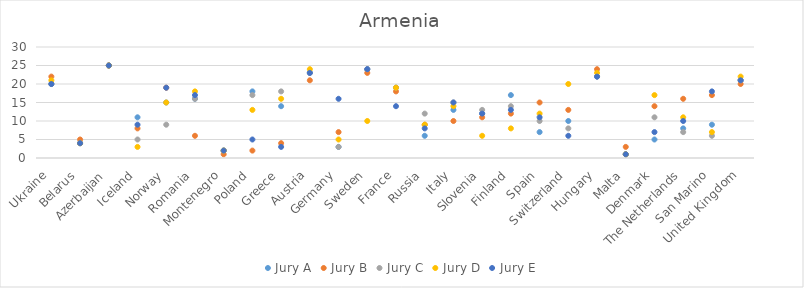
| Category | Jury A | Jury B | Jury C | Jury D | Jury E |
|---|---|---|---|---|---|
| Ukraine | 20 | 22 | 20 | 21 | 20 |
| Belarus | 4 | 5 | 4 | 4 | 4 |
| Azerbaijan | 25 | 25 | 25 | 25 | 25 |
| Iceland | 11 | 8 | 5 | 3 | 9 |
| Norway | 15 | 19 | 9 | 15 | 19 |
| Romania | 16 | 6 | 16 | 18 | 17 |
| Montenegro | 2 | 1 | 2 | 2 | 2 |
| Poland | 18 | 2 | 17 | 13 | 5 |
| Greece | 14 | 4 | 18 | 16 | 3 |
| Austria | 23 | 21 | 23 | 24 | 23 |
| Germany | 3 | 7 | 3 | 5 | 16 |
| Sweden | 24 | 23 | 24 | 10 | 24 |
| France | 19 | 18 | 19 | 19 | 14 |
| Russia | 6 | 9 | 12 | 9 | 8 |
| Italy | 13 | 10 | 15 | 14 | 15 |
| Slovenia | 12 | 11 | 13 | 6 | 12 |
| Finland | 17 | 12 | 14 | 8 | 13 |
| Spain | 7 | 15 | 10 | 12 | 11 |
| Switzerland | 10 | 13 | 8 | 20 | 6 |
| Hungary | 22 | 24 | 22 | 23 | 22 |
| Malta | 1 | 3 | 1 | 1 | 1 |
| Denmark | 5 | 14 | 11 | 17 | 7 |
| The Netherlands | 8 | 16 | 7 | 11 | 10 |
| San Marino | 9 | 17 | 6 | 7 | 18 |
| United Kingdom | 21 | 20 | 21 | 22 | 21 |